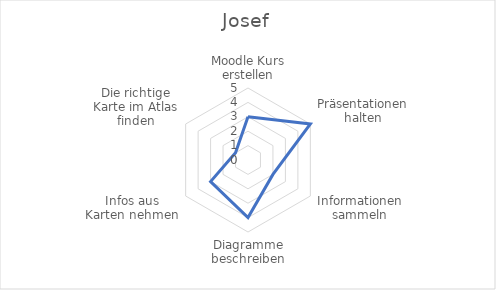
| Category | Josef |
|---|---|
| Moodle Kurs erstellen | 3 |
| Präsentationen halten | 5 |
| Informationen sammeln | 2 |
| Diagramme beschreiben | 4 |
| Infos aus Karten nehmen | 3 |
| Die richtige Karte im Atlas finden | 1 |